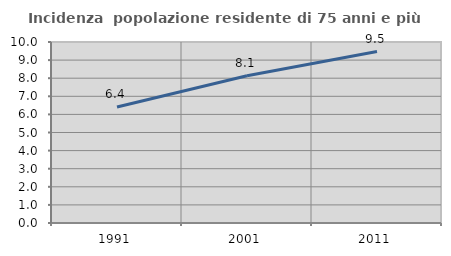
| Category | Incidenza  popolazione residente di 75 anni e più |
|---|---|
| 1991.0 | 6.41 |
| 2001.0 | 8.14 |
| 2011.0 | 9.474 |